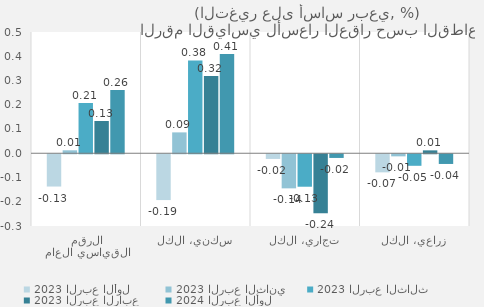
| Category | 2023 | 2024 |
|---|---|---|
| الرقم القياسي العام | 0.133 | 0.261 |
| سكني، الكل | 0.319 | 0.41 |
| تجاري، الكل | -0.243 | -0.015 |
| زراعي، الكل | 0.012 | -0.04 |